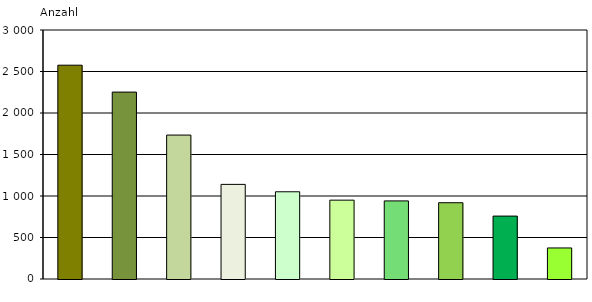
| Category | Series 0 |
|---|---|
| eingeschränkte Erziehungskompetenz der Eltern/Personensorgeberechtigten | 2576 |
| Belastungen des jungen Menschen durch familiäre Konflikte | 2252 |
| Entwicklungsauffälligkeiten/seelische Probleme des jungen Menschen | 1734 |
| Gefährdung des Kindeswohls | 1140 |
| Belastungen des jungen Menschen durch Problemlagen der Eltern | 1051 |
| unzureichende Förderung/Betreuung/Versorgung des jungen Menschen in der Familie | 950 |
| Unversorgtheit des jungen Menschen  | 941 |
| Auffälligkeiten im sozialen Verhalten (dissoziales Verhalten) des jungen Menschen | 919 |
| schulische/berufliche Probleme des jungen Menschen | 758 |
| Übernahme von einem anderen Jugendamt wegen Zuständigkeitswechsel | 374 |